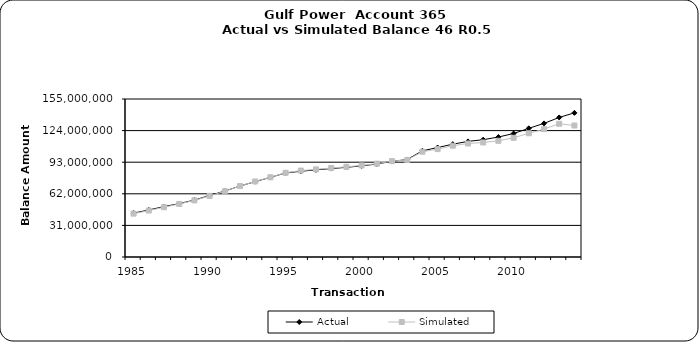
| Category | Actual | Simulated |
|---|---|---|
| 1985.0 | 43053606.34 | 42548012.824 |
| 1986.0 | 46150669.56 | 45570800.863 |
| 1987.0 | 49453774.14 | 48834113.004 |
| 1988.0 | 52361643.17 | 52051185.229 |
| 1989.0 | 55856306.1 | 55537055.988 |
| 1990.0 | 60341210.42 | 59950419.127 |
| 1991.0 | 64713602.42 | 64509306.199 |
| 1992.0 | 69640996.32 | 69627507.039 |
| 1993.0 | 73936547.19 | 74112604.27 |
| 1994.0 | 78153379.86 | 78231895.809 |
| 1995.0 | 82430299.9 | 82609928.633 |
| 1996.0 | 84087541.08 | 84770970.006 |
| 1997.0 | 85507769.08 | 85960919.577 |
| 1998.0 | 86738830.08 | 87297914.182 |
| 1999.0 | 87968289.08 | 88450749.986 |
| 2000.0 | 89414533.08 | 89824377.706 |
| 2001.0 | 91190684.78 | 91541236.333 |
| 2002.0 | 93883257.03 | 94052389.507 |
| 2003.0 | 95574316.73 | 95244375.784 |
| 2004.0 | 104182986.53 | 103297771.104 |
| 2005.0 | 107361370.53 | 105821736.026 |
| 2006.0 | 110697328.53 | 109178487.968 |
| 2007.0 | 113403044.53 | 111327582.939 |
| 2008.0 | 115071323.53 | 112345092.832 |
| 2009.0 | 117679022.78 | 113979855.205 |
| 2010.0 | 121153914.39 | 116933096.765 |
| 2011.0 | 126258110.99 | 121377939.073 |
| 2012.0 | 131065267.26 | 125448973.943 |
| 2013.0 | 136905621.65 | 130694955.094 |
| 2014.0 | 141411299.12 | 128996481.519 |